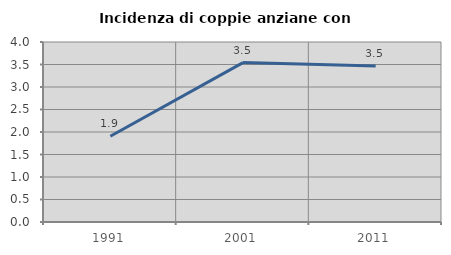
| Category | Incidenza di coppie anziane con figli |
|---|---|
| 1991.0 | 1.905 |
| 2001.0 | 3.542 |
| 2011.0 | 3.469 |